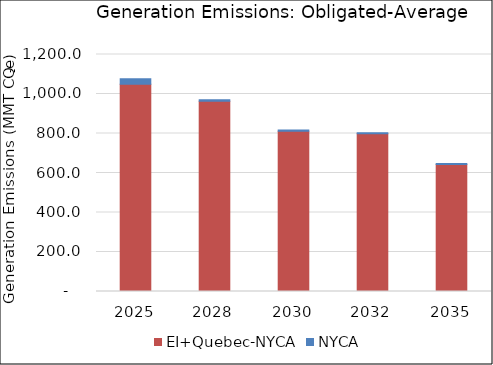
| Category | EI+Quebec-NYCA | NYCA |
|---|---|---|
| 2025.0 | 1049.79 | 27.52 |
| 2028.0 | 962.89 | 8.52 |
| 2030.0 | 811.45 | 6.13 |
| 2032.0 | 798.36 | 6.03 |
| 2035.0 | 643.08 | 5.26 |